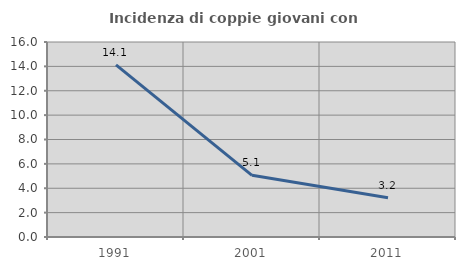
| Category | Incidenza di coppie giovani con figli |
|---|---|
| 1991.0 | 14.118 |
| 2001.0 | 5.063 |
| 2011.0 | 3.226 |